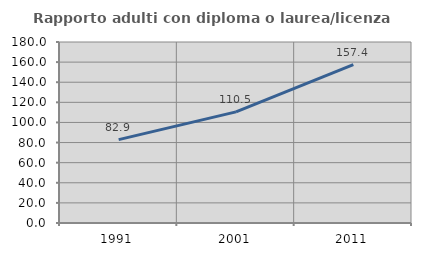
| Category | Rapporto adulti con diploma o laurea/licenza media  |
|---|---|
| 1991.0 | 82.927 |
| 2001.0 | 110.544 |
| 2011.0 | 157.413 |